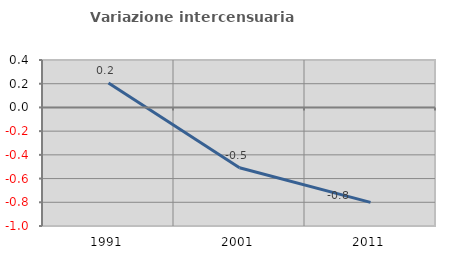
| Category | Variazione intercensuaria annua |
|---|---|
| 1991.0 | 0.206 |
| 2001.0 | -0.508 |
| 2011.0 | -0.801 |